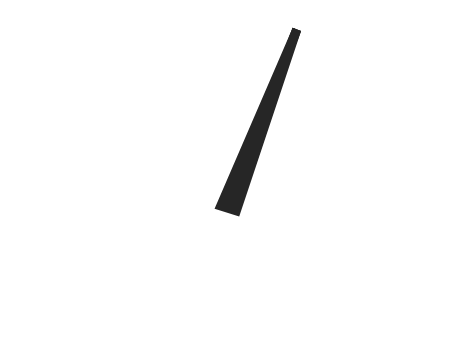
| Category | x |
|---|---|
| 66.44333233692916 | 47.219 |
| 51.88875274047496 | -0.658 |
| 48.11124725952504 | 0.658 |
| 66.44333233692916 | 47.219 |
| 50.0 | 0 |